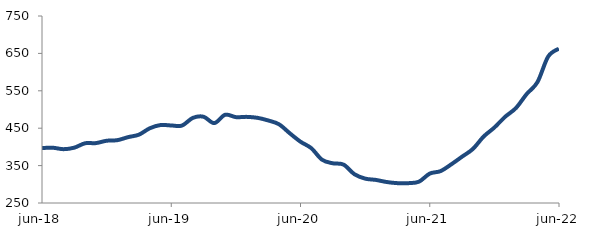
| Category | Series 0 |
|---|---|
| 2018-06-01 | 396.928 |
| 2018-07-01 | 397.759 |
| 2018-08-01 | 393.899 |
| 2018-09-01 | 397.981 |
| 2018-10-01 | 409.711 |
| 2018-11-01 | 410.128 |
| 2018-12-01 | 416.457 |
| 2019-01-01 | 418.023 |
| 2019-02-01 | 426.141 |
| 2019-03-01 | 432.718 |
| 2019-04-01 | 449.714 |
| 2019-05-01 | 458.458 |
| 2019-06-01 | 457.312 |
| 2019-07-01 | 457.058 |
| 2019-08-01 | 477.544 |
| 2019-09-01 | 480.652 |
| 2019-10-01 | 463.67 |
| 2019-11-01 | 485.887 |
| 2019-12-01 | 479.593 |
| 2020-01-01 | 480.293 |
| 2020-02-01 | 477.774 |
| 2020-03-01 | 470.708 |
| 2020-04-01 | 460.537 |
| 2020-05-01 | 436.562 |
| 2020-06-01 | 413.857 |
| 2020-07-01 | 396.652 |
| 2020-08-01 | 365.687 |
| 2020-09-01 | 356.18 |
| 2020-10-01 | 352.658 |
| 2020-11-01 | 327.164 |
| 2020-12-01 | 315.173 |
| 2021-01-01 | 311.708 |
| 2021-02-01 | 306.103 |
| 2021-03-01 | 303.075 |
| 2021-04-01 | 303.034 |
| 2021-05-01 | 306.996 |
| 2021-06-01 | 328.614 |
| 2021-07-01 | 335.232 |
| 2021-08-01 | 353.414 |
| 2021-09-01 | 373.869 |
| 2021-10-01 | 394.393 |
| 2021-11-01 | 427.592 |
| 2021-12-01 | 451.83 |
| 2022-01-01 | 480.528 |
| 2022-02-01 | 503.882 |
| 2022-03-01 | 541.428 |
| 2022-04-01 | 573.261 |
| 2022-05-01 | 641.774 |
| 2022-06-01 | 662.728 |